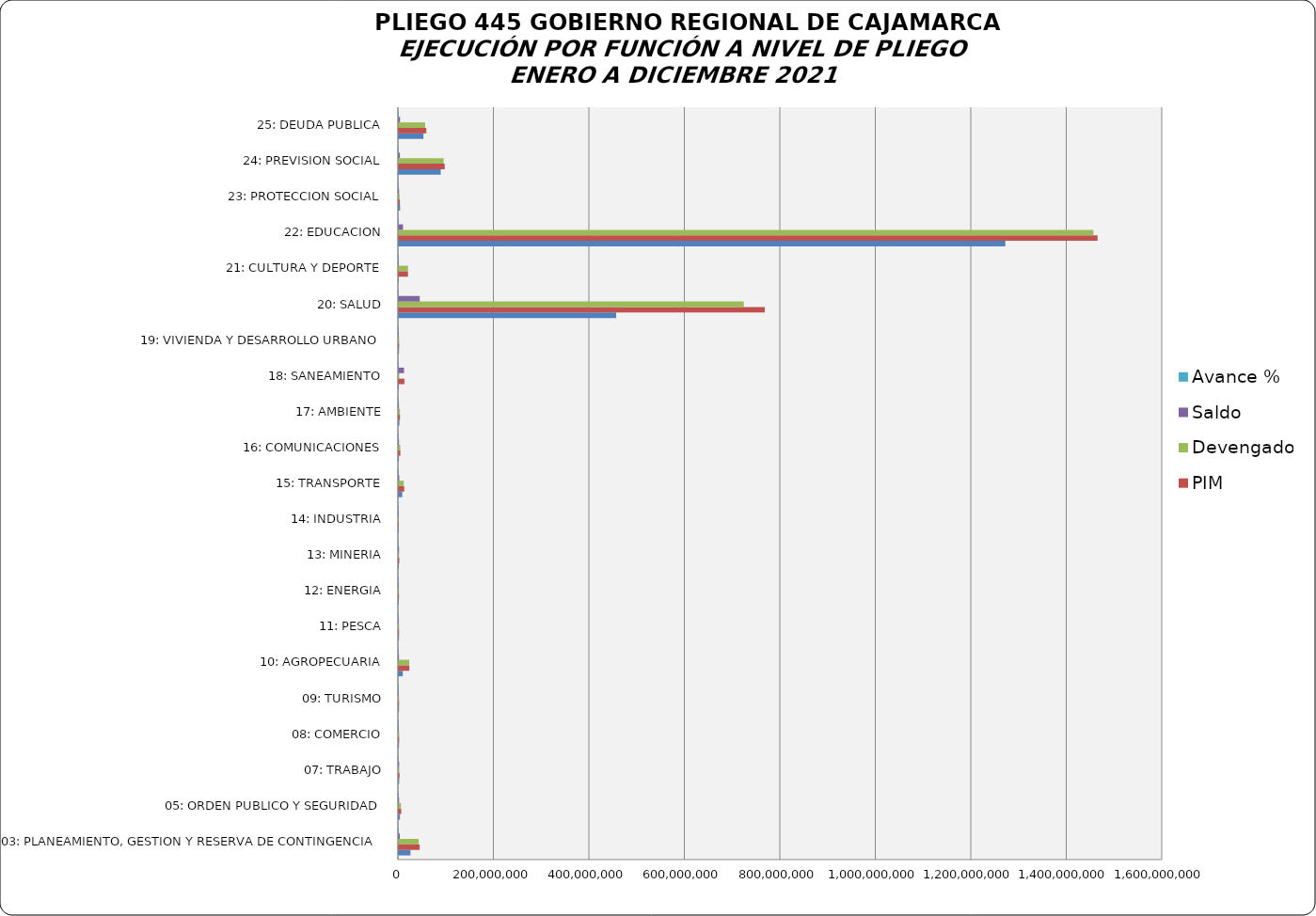
| Category | PIA | PIM | Devengado  | Saldo | Avance %  |
|---|---|---|---|---|---|
| 03: PLANEAMIENTO, GESTION Y RESERVA DE CONTINGENCIA | 24330713 | 43615287 | 41559629 | 2055658 | 0.953 |
| 05: ORDEN PUBLICO Y SEGURIDAD | 2289690 | 4936653 | 4376085 | 560568 | 0.886 |
| 07: TRABAJO | 705403 | 1504685 | 796139 | 708546 | 0.529 |
| 08: COMERCIO | 295536 | 677420 | 654698 | 22722 | 0.966 |
| 09: TURISMO | 303102 | 473005 | 461577 | 11428 | 0.976 |
| 10: AGROPECUARIA | 8282372 | 22061842 | 21750694 | 311148 | 0.986 |
| 11: PESCA | 304597 | 509960 | 478829 | 31131 | 0.939 |
| 12: ENERGIA | 3836 | 320046 | 286985 | 33061 | 0.897 |
| 13: MINERIA | 132456 | 1011752 | 482384 | 529368 | 0.477 |
| 14: INDUSTRIA | 9900 | 19980 | 16582 | 3398 | 0.83 |
| 15: TRANSPORTE | 7089124 | 11168713 | 10231680 | 937033 | 0.916 |
| 16: COMUNICACIONES | 226685 | 3230714 | 2890434 | 340280 | 0.895 |
| 17: AMBIENTE | 1209890 | 2477120 | 2236383 | 240737 | 0.903 |
| 18: SANEAMIENTO | 107890 | 11639450 | 817533 | 10821917 | 0.07 |
| 19: VIVIENDA Y DESARROLLO URBANO | 332948 | 714990 | 645596 | 69394 | 0.903 |
| 20: SALUD | 455206376 | 766467103 | 722684829 | 43782274 | 0.943 |
| 21: CULTURA Y DEPORTE | 33973 | 19170922 | 19169424 | 1498 | 1 |
| 22: EDUCACION | 1270355077 | 1463698774 | 1454987043 | 8711731 | 0.994 |
| 23: PROTECCION SOCIAL | 2682593 | 2117769 | 1651138 | 466631 | 0.78 |
| 24: PREVISION SOCIAL | 87712150 | 96039695 | 93815226 | 2224469 | 0.977 |
| 25: DEUDA PUBLICA | 51470892 | 57559410 | 54991143 | 2568267 | 0.955 |